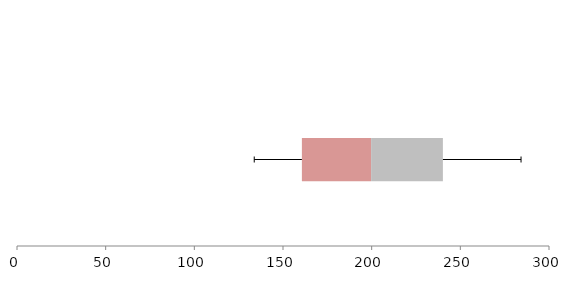
| Category | Series 1 | Series 2 | Series 3 |
|---|---|---|---|
| 0 | 160.652 | 39.036 | 40.478 |